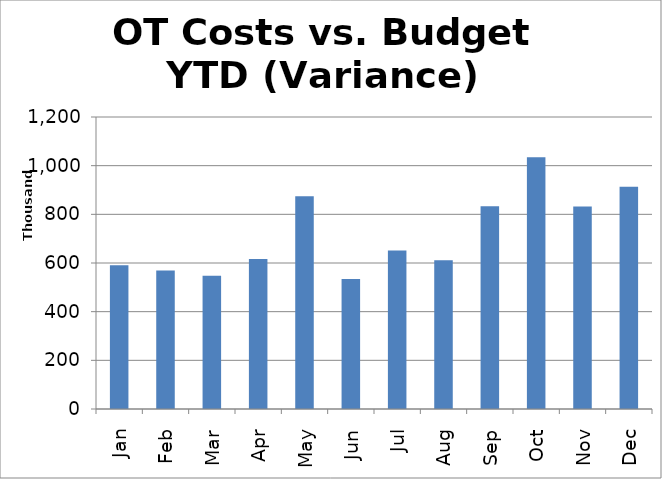
| Category | Exempt | Non-Exempt |
|---|---|---|
| Jan | 590389 |  |
| Feb | 569475 |  |
| Mar | 547955 |  |
| Apr | 616268 |  |
| May | 873829 |  |
| Jun | 533917.44 |  |
| Jul | 651465.33 |  |
| Aug | 611355 |  |
| Sep | 832732 |  |
| Oct | 1034346.75 |  |
| Nov | 832218.21 |  |
| Dec | 913286.03 |  |